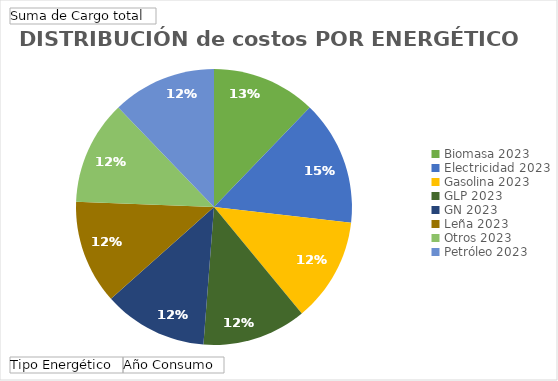
| Category | Total |
|---|---|
| 0 | 1560000 |
| 1 | 1872600 |
| 2 | 1560000 |
| 3 | 1560000 |
| 4 | 1560000 |
| 5 | 1560000 |
| 6 | 1560000 |
| 7 | 1560000 |